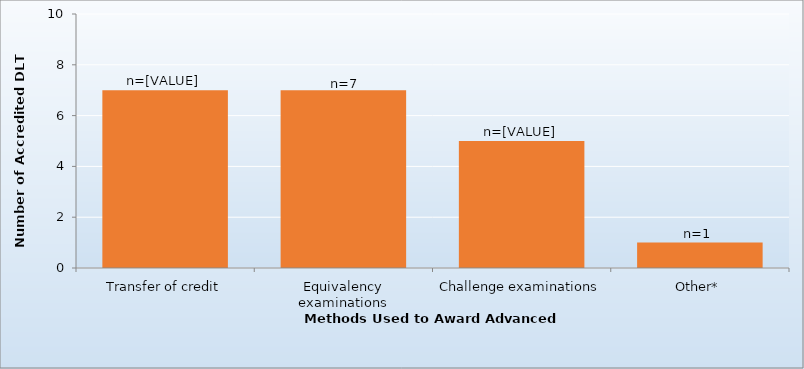
| Category | 2016-17 |
|---|---|
| Transfer of credit | 7 |
| Equivalency examinations | 7 |
| Challenge examinations | 5 |
| Other* | 1 |